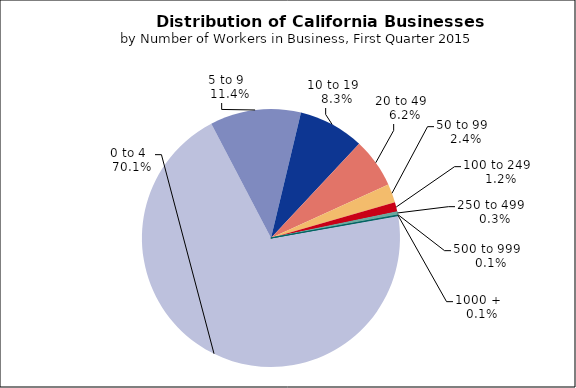
| Category | Series 0 |
|---|---|
| 0 to 4   | 0.701 |
| 5 to 9   | 0.114 |
| 10 to 19   | 0.082 |
| 20 to 49   | 0.062 |
| 50 to 99   | 0.023 |
| 100 to 249   | 0.012 |
| 250 to 499   | 0.003 |
| 500 to 999   | 0.001 |
| 1000 +   | 0.001 |